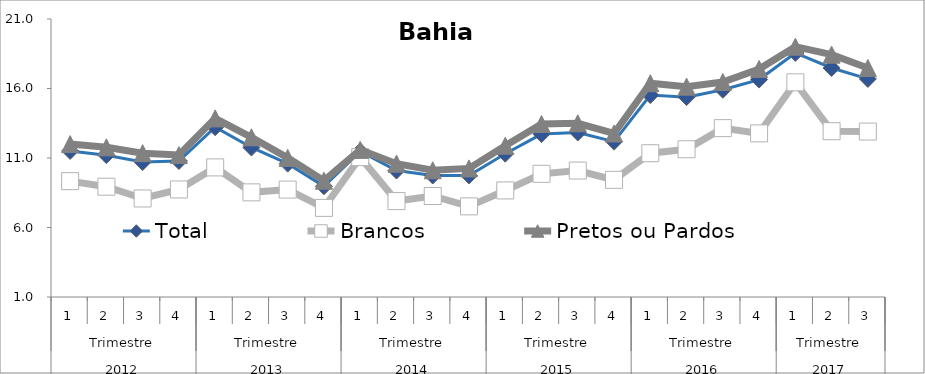
| Category | Total | Brancos | Pretos ou Pardos |
|---|---|---|---|
| 0 | 11.511 | 9.335 | 12 |
| 1 | 11.204 | 8.935 | 11.766 |
| 2 | 10.706 | 8.088 | 11.347 |
| 3 | 10.782 | 8.736 | 11.212 |
| 4 | 13.215 | 10.322 | 13.849 |
| 5 | 11.756 | 8.528 | 12.489 |
| 6 | 10.594 | 8.727 | 11.009 |
| 7 | 8.964 | 7.411 | 9.37 |
| 8 | 11.473 | 11.061 | 11.584 |
| 9 | 10.099 | 7.901 | 10.593 |
| 10 | 9.74 | 8.267 | 10.118 |
| 11 | 9.742 | 7.52 | 10.251 |
| 12 | 11.308 | 8.667 | 11.883 |
| 13 | 12.72 | 9.862 | 13.449 |
| 14 | 12.834 | 10.098 | 13.497 |
| 15 | 12.178 | 9.429 | 12.764 |
| 16 | 15.524 | 11.344 | 16.38 |
| 17 | 15.378 | 11.629 | 16.134 |
| 18 | 15.909 | 13.149 | 16.466 |
| 19 | 16.642 | 12.772 | 17.405 |
| 20 | 18.559 | 16.444 | 19.008 |
| 21 | 17.475 | 12.928 | 18.433 |
| 22 | 16.69 | 12.901 | 17.474 |